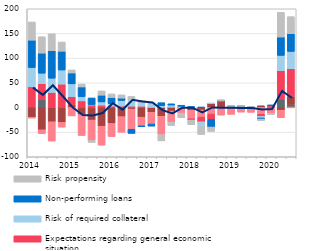
| Category | Other factors | Costs of funding | Competition from other banks | Expectations regarding general economic situation | Risk of required collateral  | Non-performing loans  | Risk propensity |
|---|---|---|---|---|---|---|---|
| 2014.0 | 0.8 | -19.9 | -1.7 | 41 | 39.1 | 55.5 | 36.9 |
| nan | 16.1 | -45.3 | -7.7 | 31.9 | 21.4 | 40.8 | 33.2 |
| nan | 0 | -29 | -39.1 | 30.4 | 28.9 | 55.7 | 34.4 |
| nan | 0 | -30.3 | -9.6 | 47.3 | 28.6 | 38.1 | 18.7 |
| 2015.0 | 0 | 5.3 | -17.2 | 16.4 | 26.1 | 22.1 | 6.2 |
| nan | 0 | -14.5 | -42.3 | 13.3 | 8.7 | 19.6 | 6 |
| nan | -0.9 | -24.7 | -41.2 | 5.2 | 0.6 | 13.5 | -4.1 |
| nan | 0.5 | -38.1 | -38.3 | 4.2 | 6.5 | 13.7 | 8.7 |
| 2016.0 | 0 | -32.5 | -26.6 | 2.8 | 4.8 | 12.6 | 7.3 |
| nan | 0 | -18.6 | -31.7 | 2.8 | 11.4 | 4.8 | 6.6 |
| nan | 0 | -3.2 | -40.9 | 2.6 | 11.7 | -8.5 | 8 |
| nan | 0 | -19.7 | -17.5 | 2.6 | 6.4 | -2 | 5.6 |
| 2017.0 | 0 | -9.9 | -23.6 | 0.3 | 6.6 | -4.3 | 1.9 |
| nan | 0 | -17.9 | -37.2 | 0.4 | 3.4 | 5.9 | -12.7 |
| nan | 0 | -7.4 | -22.4 | 0.6 | 4.3 | 2.5 | -6.8 |
| nan | 0 | -2.2 | -9.3 | 0.1 | 2.2 | 2.2 | -9.5 |
| 2018.0 | 0 | -5.5 | -17.5 | -2.5 | 0 | 1.9 | -9.6 |
| nan | 0 | -5.2 | -14.4 | -9.5 | -9.1 | 0.3 | -16.5 |
| nan | 0 | 8.2 | -13.3 | -10.8 | 0.3 | -15.6 | -8.9 |
| nan | 0 | 13.5 | -15.5 | 0.1 | 0.3 | 0.3 | 0.1 |
| 2019.0 | 0 | 0 | -14 | 0.1 | 2.4 | 0.3 | 0.1 |
| nan | 0 | 2.3 | -9.4 | 0.1 | 0.3 | 0.3 | 0.1 |
| nan | 0 | 0 | -9.9 | 0.1 | 0.4 | 0.4 | 0.1 |
| nan | 0 | 3.5 | -13.7 | -4.4 | -3.2 | -2.2 | -3.4 |
| 2020.0 | 0 | 0 | -11.9 | 3.7 | 0.4 | 0.4 | -2.6 |
| nan | 16.6 | -5.6 | -15.1 | 57.7 | 31.2 | 37.3 | 50 |
| nan | 6.7 | 15.9 | -0.1 | 55.9 | 35 | 36.1 | 34.5 |